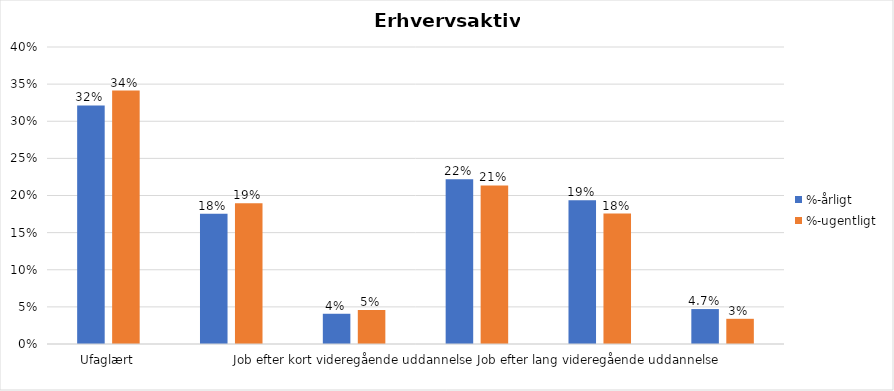
| Category | %-årligt | %-ugentligt |
|---|---|---|
| Ufaglært | 0.321 | 0.341 |
| Erhvervsfagligt job | 0.176 | 0.19 |
| Job efter kort videregående uddannelse | 0.041 | 0.046 |
| Job efter mellemlang videregående uddannelse | 0.222 | 0.214 |
| Job efter lang videregående uddannelse | 0.194 | 0.176 |
| Selvstændig | 0.047 | 0.034 |